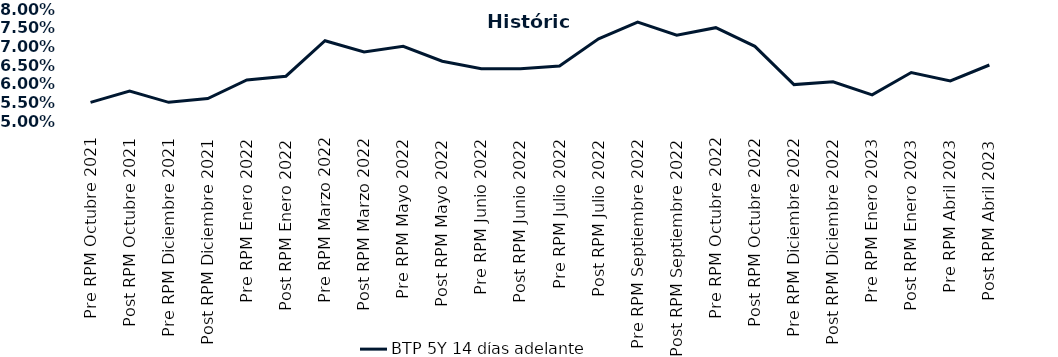
| Category | BTP 5Y 14 días adelante |
|---|---|
| Pre RPM Octubre 2021 | 0.055 |
| Post RPM Octubre 2021 | 0.058 |
| Pre RPM Diciembre 2021 | 0.055 |
| Post RPM Diciembre 2021 | 0.056 |
| Pre RPM Enero 2022 | 0.061 |
| Post RPM Enero 2022 | 0.062 |
| Pre RPM Marzo 2022 | 0.072 |
| Post RPM Marzo 2022 | 0.068 |
| Pre RPM Mayo 2022 | 0.07 |
| Post RPM Mayo 2022 | 0.066 |
| Pre RPM Junio 2022 | 0.064 |
| Post RPM Junio 2022 | 0.064 |
| Pre RPM Julio 2022 | 0.065 |
| Post RPM Julio 2022 | 0.072 |
| Pre RPM Septiembre 2022 | 0.076 |
| Post RPM Septiembre 2022 | 0.073 |
| Pre RPM Octubre 2022 | 0.075 |
| Post RPM Octubre 2022 | 0.07 |
| Pre RPM Diciembre 2022 | 0.06 |
| Post RPM Diciembre 2022 | 0.06 |
| Pre RPM Enero 2023 | 0.057 |
| Post RPM Enero 2023 | 0.063 |
| Pre RPM Abril 2023 | 0.061 |
| Post RPM Abril 2023 | 0.065 |